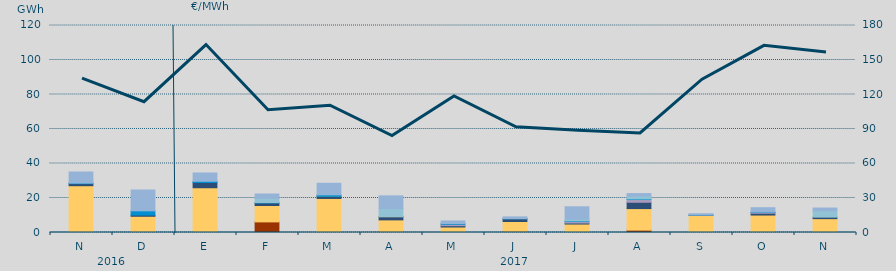
| Category | Carbón | Ciclo Combinado | Cogeneración | Consumo Bombeo | Enlace Península Baleares | Eólica | Hidráulica | Internacionales | Otras Renovables | Residuos no Renovables | Solar fotovoltaica | Turbinación bombeo |
|---|---|---|---|---|---|---|---|---|---|---|---|---|
| N | 0 | 27130.5 | 0 | 1183.5 | 0 | 0 | 312.1 | 0 | 0 | 0 | 0 | 6456 |
| D | 0 | 9410.5 | 0 | 701.1 | 0 | 0 | 2449.9 | 0 | 0 | 0 | 0 | 12070.5 |
| E | 0 | 25945.3 | 0 | 3031.3 | 0 | 0 | 733.3 | 0 | 0 | 0 | 0 | 4804 |
| F | 6150 | 9508.4 | 0 | 1469.4 | 0 | 0 | 198 | 2463.6 | 0 | 0 | 0 | 2519.7 |
| M | 0 | 19740.7 | 0 | 1177.9 | 20.4 | 43.7 | 849.6 | 0 | 0 | 0 | 0 | 6709.7 |
| A | 610 | 6714.7 | 0 | 1740 | 132.6 | 93.7 | 0 | 4549.7 | 0 | 0 | 0 | 7385.9 |
| M | 70 | 3116.9 | 0 | 762.7 | 846.6 | 0 | 410 | 0 | 0 | 0 | 0 | 1489.3 |
| J | 673.2 | 5702.5 | 0 | 1567.6 | 28.4 | 0 | 149.4 | 0 | 0 | 0 | 0 | 940.1 |
| J | 0 | 4906.7 | 0 | 593.2 | 844.1 | 0 | 376.7 | 973.2 | 0 | 0 | 0 | 7214.8 |
| A | 1372.5 | 12488.5 | 0 | 3675.7 | 1561.2 | 0 | 359.5 | 1700.4 | 0 | 0 | 0 | 1397.9 |
| S | 0 | 9962.3 | 0 | 123.8 | 0 | 0 | 40 | 0 | 0 | 0 | 0 | 759.3 |
| O | 0 | 10119.2 | 0 | 1038.2 | 495.2 | 0 | 208.4 | 0 | 0 | 0 | 0 | 2510.5 |
| N | 0 | 8034.3 | 0 | 863.8 | 0 | 0 | 0 | 3635.7 | 0 | 0 | 0 | 1650.6 |